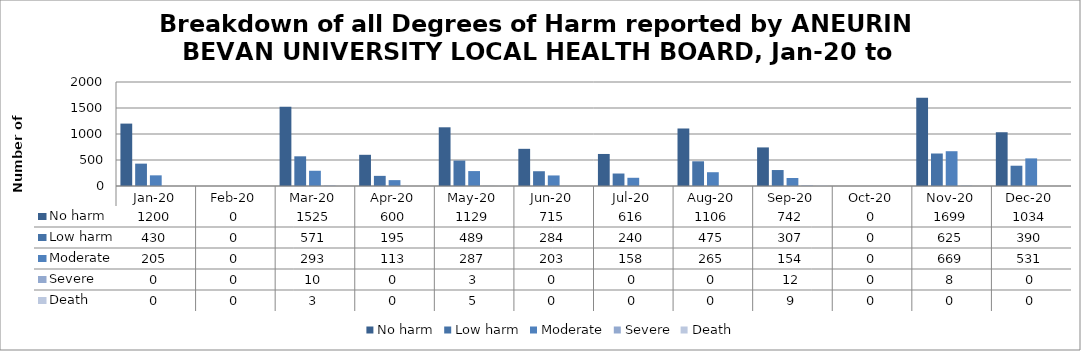
| Category | No harm | Low harm | Moderate | Severe | Death |
|---|---|---|---|---|---|
| Jan-20 | 1200 | 430 | 205 | 0 | 0 |
| Feb-20 | 0 | 0 | 0 | 0 | 0 |
| Mar-20 | 1525 | 571 | 293 | 10 | 3 |
| Apr-20 | 600 | 195 | 113 | 0 | 0 |
| May-20 | 1129 | 489 | 287 | 3 | 5 |
| Jun-20 | 715 | 284 | 203 | 0 | 0 |
| Jul-20 | 616 | 240 | 158 | 0 | 0 |
| Aug-20 | 1106 | 475 | 265 | 0 | 0 |
| Sep-20 | 742 | 307 | 154 | 12 | 9 |
| Oct-20 | 0 | 0 | 0 | 0 | 0 |
| Nov-20 | 1699 | 625 | 669 | 8 | 0 |
| Dec-20 | 1034 | 390 | 531 | 0 | 0 |